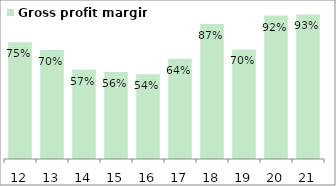
| Category | Gross profit margin |
|---|---|
| 2012-03-31 | 0.748 |
| 2013-03-31 | 0.701 |
| 2014-03-31 | 0.572 |
| 2015-03-31 | 0.557 |
| 2016-03-31 | 0.543 |
| 2017-03-31 | 0.642 |
| 2018-03-31 | 0.865 |
| 2019-03-31 | 0.702 |
| 2020-03-31 | 0.92 |
| 2021-03-31 | 0.926 |